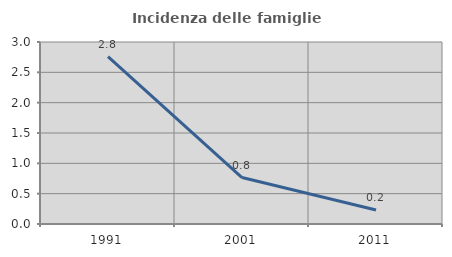
| Category | Incidenza delle famiglie numerose |
|---|---|
| 1991.0 | 2.759 |
| 2001.0 | 0.765 |
| 2011.0 | 0.23 |